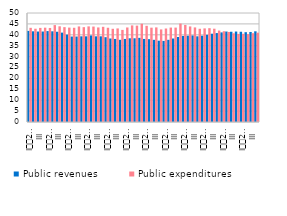
| Category | Public revenues | Public expenditures |
|---|---|---|
| I
2007 | 41.8 | 43.2 |
| II | 41.6 | 42.792 |
| III | 41.5 | 43.161 |
| IV | 41.5 | 43.268 |
| I
2008 | 41.7 | 43.139 |
| II | 41.6 | 44.449 |
| III | 41.4 | 43.897 |
| IV | 41 | 43.511 |
| I
2009 | 40.1 | 43.301 |
| II | 39.2 | 43.223 |
| III | 39.2 | 43.838 |
| IV | 39.3 | 43.508 |
| I
2010 | 39.3 | 43.863 |
| II | 39.7 | 43.782 |
| III | 39.3 | 43.371 |
| IV | 39.3 | 43.668 |
| I
2011 | 38.9 | 43.234 |
| II | 38.3 | 42.761 |
| III | 38.1 | 42.925 |
| IV | 37.7 | 42.248 |
| I
2012 | 38.1 | 43.358 |
| II | 38.4 | 44.317 |
| III | 38.4 | 44.213 |
| IV | 38.6 | 45.073 |
| I
2013 | 38.1 | 44.124 |
| II | 38 | 43.272 |
| III | 37.7 | 43.393 |
| IV | 37.3 | 42.467 |
| I
2014 | 37.2 | 42.885 |
| II | 37.7 | 43.315 |
| III | 38.3 | 43.303 |
| IV | 39 | 45.159 |
| I
2015 | 39.5 | 44.522 |
| II | 39.6 | 43.838 |
| III | 39.7 | 43.382 |
| IV | 39.3 | 42.763 |
| I
2016 | 39.6 | 42.941 |
| II | 40 | 43.04 |
| III | 40.5 | 42.804 |
| IV | 40.8 | 41.95 |
| I
2017 | 41.1 | 41.639 |
| II | 41.5 | 41.305 |
| III | 41.4 | 40.697 |
| IV | 41.5 | 40.407 |
| I
2018 | 41.4 | 40.457 |
| II | 41.2 | 40.307 |
| III | 41.3 | 40.745 |
| IV | 41.6 | 40.972 |